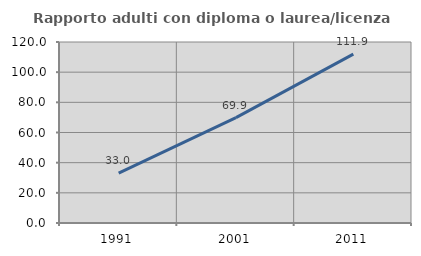
| Category | Rapporto adulti con diploma o laurea/licenza media  |
|---|---|
| 1991.0 | 33.028 |
| 2001.0 | 69.863 |
| 2011.0 | 111.921 |